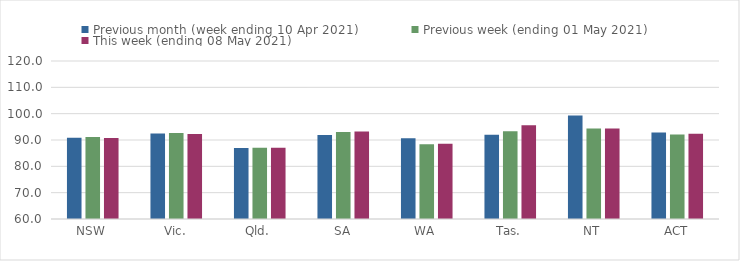
| Category | Previous month (week ending 10 Apr 2021) | Previous week (ending 01 May 2021) | This week (ending 08 May 2021) |
|---|---|---|---|
| NSW | 90.9 | 91.12 | 90.8 |
| Vic. | 92.43 | 92.63 | 92.25 |
| Qld. | 87 | 87.01 | 87.1 |
| SA | 91.91 | 93.01 | 93.25 |
| WA | 90.69 | 88.43 | 88.6 |
| Tas. | 92.03 | 93.28 | 95.63 |
| NT | 99.34 | 94.35 | 94.35 |
| ACT | 92.82 | 92.13 | 92.38 |